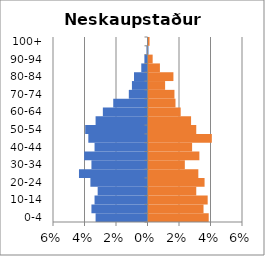
| Category | % Men | % Women |
|---|---|---|
| 0-4 | -0.033 | 0.038 |
| 5-9 | -0.036 | 0.035 |
| 10-14 | -0.034 | 0.038 |
| 15-19 | -0.032 | 0.03 |
| 20-24 | -0.036 | 0.036 |
| 25-29 | -0.044 | 0.032 |
| 30-34 | -0.036 | 0.023 |
| 35-39 | -0.04 | 0.032 |
| 40-44 | -0.034 | 0.028 |
| 45-49 | -0.038 | 0.04 |
| 50-54 | -0.04 | 0.03 |
| 55-59 | -0.033 | 0.027 |
| 60-64 | -0.028 | 0.02 |
| 65-69 | -0.022 | 0.017 |
| 70-74 | -0.012 | 0.016 |
| 75-79 | -0.01 | 0.011 |
| 80-84 | -0.009 | 0.016 |
| 85-89 | -0.004 | 0.007 |
| 90-94 | -0.002 | 0.003 |
| 95-99 | -0.001 | 0 |
| 100+ | 0 | 0.001 |